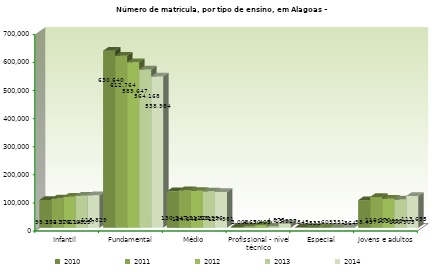
| Category | 2010 | 2011 | 2012 | 2013 | 2014 |
|---|---|---|---|---|---|
| Infantil  | 99372 | 104376 | 110705 | 114157 | 115829 |
| Fundamental | 630640 | 612764 | 589647 | 564168 | 538984 |
| Médio | 130247 | 134045 | 131801 | 129996 | 127981 |
| Profissional - nível técnico | 3009 | 4670 | 9409 | 4875 | 15927 |
| Especial | 845 | 533 | 609 | 391 | 364 |
| Jovens e adultos | 98497 | 110270 | 103833 | 100905 | 113655 |